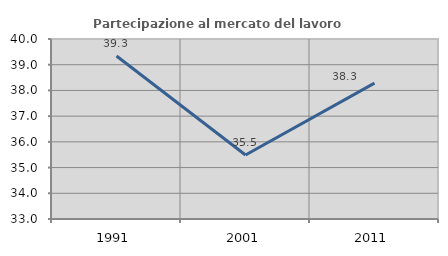
| Category | Partecipazione al mercato del lavoro  femminile |
|---|---|
| 1991.0 | 39.34 |
| 2001.0 | 35.488 |
| 2011.0 | 38.284 |